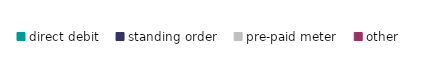
| Category | "data" for legend - do not delete |
|---|---|
| direct debit | 0 |
| standing order | 0 |
| pre-paid meter | 0 |
| other | 0 |